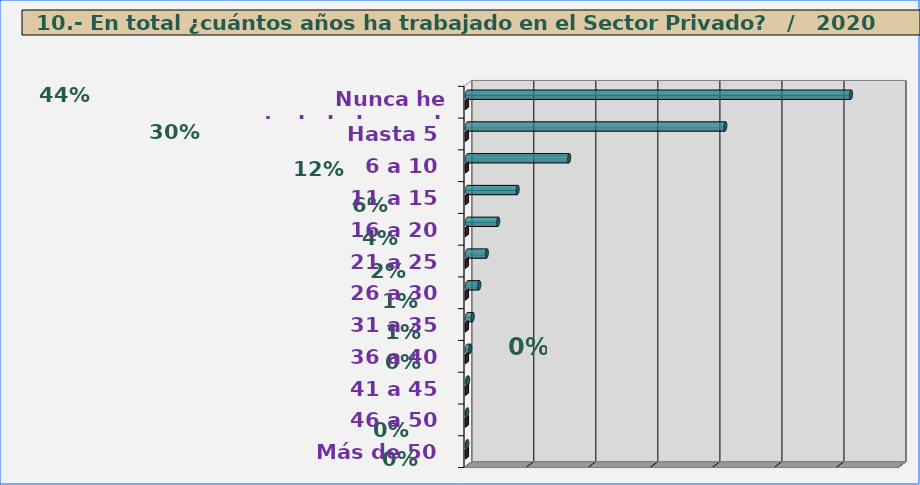
| Category | Series 0 | Series 1 |
|---|---|---|
| Nunca he trabajado en el Sector Privado | 6191 | 0.442 |
| Hasta 5 | 4164 | 0.297 |
| 6 a 10 | 1647 | 0.118 |
| 11 a 15 | 816 | 0.058 |
| 16 a 20 | 503 | 0.036 |
| 21 a 25 | 320 | 0.023 |
| 26 a 30 | 198 | 0.014 |
| 31 a 35 | 92 | 0.007 |
| 36 a 40 | 52 | 0.004 |
| 41 a 45 | 18 | 0.001 |
| 46 a 50 | 3 | 0 |
| Más de 50 | 5 | 0 |